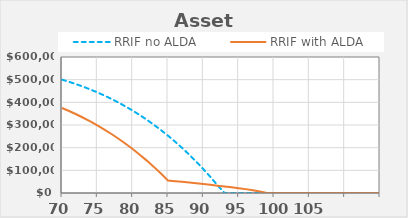
| Category | RRIF no ALDA |  RRIF with ALDA |
|---|---|---|
| 70 | 500000 | 375000 |
| 71 | 490500 | 361625 |
| 72 | 480180.5 | 347310.375 |
| 73 | 469005.071 | 332015.972 |
| 74 | 456935.921 | 315700.16 |
| 75 | 443933.854 | 298319.784 |
| 76 | 429958.214 | 279830.108 |
| 77 | 414966.839 | 260184.762 |
| 78 | 398916.01 | 239335.689 |
| 79 | 381760.395 | 217233.084 |
| 80 | 363452.994 | 193825.336 |
| 81 | 343945.081 | 169058.966 |
| 82 | 323186.15 | 142878.565 |
| 83 | 301123.845 | 115226.725 |
| 84 | 277703.907 | 86043.976 |
| 85 | 252870.1 | 55268.711 |
| 86 | 226564.15 | 52278.674 |
| 87 | 198725.672 | 49199.46 |
| 88 | 169292.1 | 46026.095 |
| 89 | 138198.612 | 42753.639 |
| 90 | 105378.053 | 39380.377 |
| 91 | 70760.858 | 35907.028 |
| 92 | 34274.967 | 32330.688 |
| 93 | 0 | 28648.223 |
| 94 | 0 | 24855.198 |
| 95 | 0 | 20955.417 |
| 96 | 0 | 17072.696 |
| 97 | 0 | 12186.931 |
| 98 | 0 | 6248.492 |
| 99 | 0 | 0 |
| 100 | 0 | 0 |
| 101 | 0 | 0 |
| 102 | 0 | 0 |
| 103 | 0 | 0 |
| 104 | 0 | 0 |
| 105 | 0 | 0 |